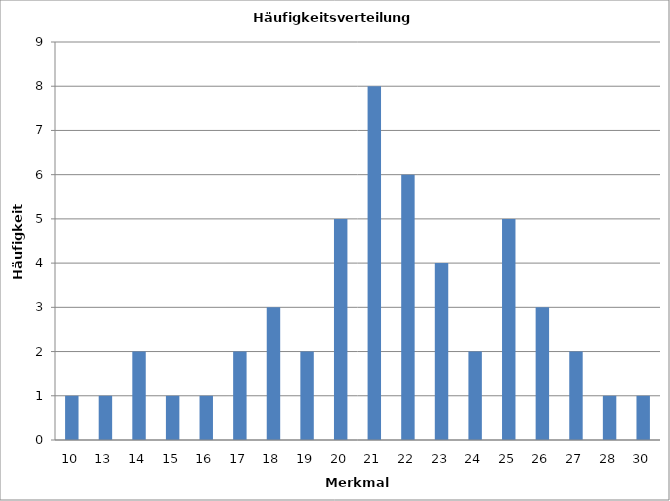
| Category | Series 0 |
|---|---|
| 10.0 | 1 |
| 13.0 | 1 |
| 14.0 | 2 |
| 15.0 | 1 |
| 16.0 | 1 |
| 17.0 | 2 |
| 18.0 | 3 |
| 19.0 | 2 |
| 20.0 | 5 |
| 21.0 | 8 |
| 22.0 | 6 |
| 23.0 | 4 |
| 24.0 | 2 |
| 25.0 | 5 |
| 26.0 | 3 |
| 27.0 | 2 |
| 28.0 | 1 |
| 30.0 | 1 |